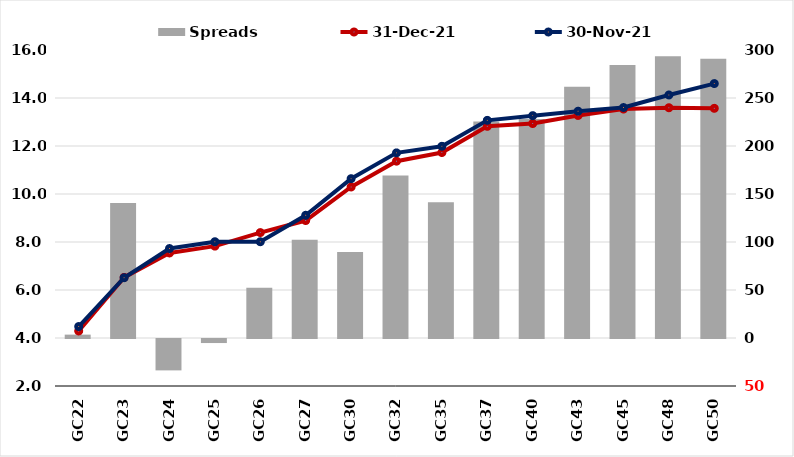
| Category |  Spreads   |
|---|---|
| GC22 | 3.519 |
| GC23 | 140.6 |
| GC24 | -32.7 |
| GC25 | -4.21 |
| GC26 | 52.24 |
| GC27 | 102.39 |
| GC30 | 89.69 |
| GC32 | 169.23 |
| GC35 | 141.28 |
| GC37 | 225.42 |
| GC40 | 228.08 |
| GC43 | 261.69 |
| GC45 | 284.44 |
| GC48 | 293.43 |
| GC50 | 290.99 |